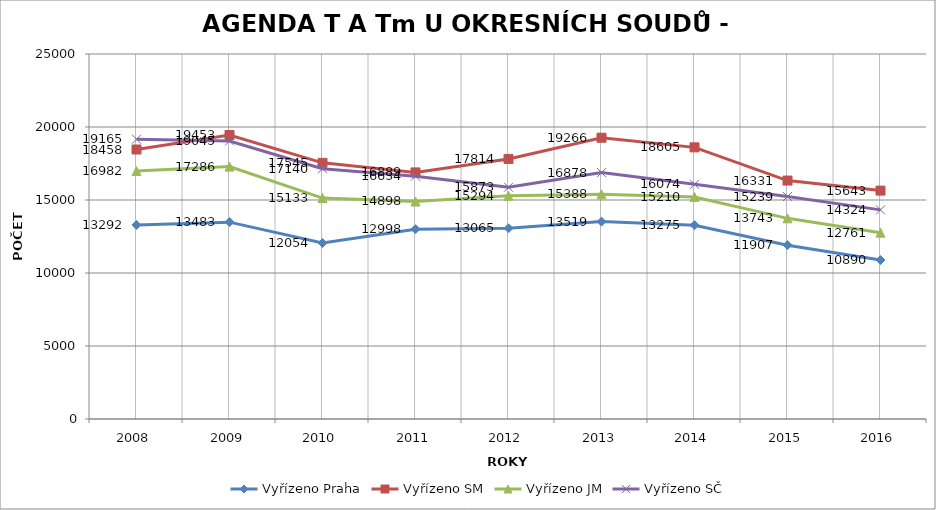
| Category | Vyřízeno Praha | Vyřízeno SM | Vyřízeno JM | Vyřízeno SČ |
|---|---|---|---|---|
| 2008.0 | 13292 | 18458 | 16982 | 19165 |
| 2009.0 | 13483 | 19453 | 17286 | 19045 |
| 2010.0 | 12054 | 17545 | 15133 | 17140 |
| 2011.0 | 12998 | 16889 | 14898 | 16634 |
| 2012.0 | 13065 | 17814 | 15294 | 15873 |
| 2013.0 | 13519 | 19266 | 15388 | 16878 |
| 2014.0 | 13275 | 18605 | 15210 | 16074 |
| 2015.0 | 11907 | 16331 | 13743 | 15239 |
| 2016.0 | 10890 | 15643 | 12761 | 14324 |